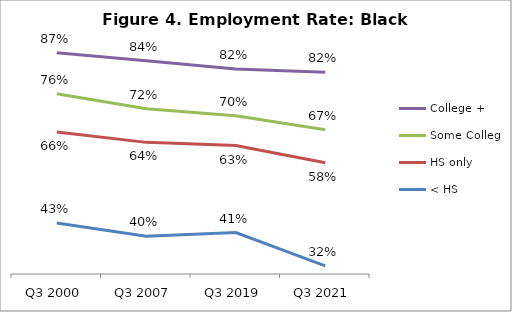
| Category | College + | Some College | HS only | < HS |
|---|---|---|---|---|
| Q3 2000 | 0.865 | 0.76 | 0.662 | 0.43 |
| Q3 2007 | 0.845 | 0.722 | 0.636 | 0.397 |
| Q3 2019 | 0.824 | 0.704 | 0.628 | 0.406 |
| Q3 2021 | 0.815 | 0.668 | 0.584 | 0.321 |